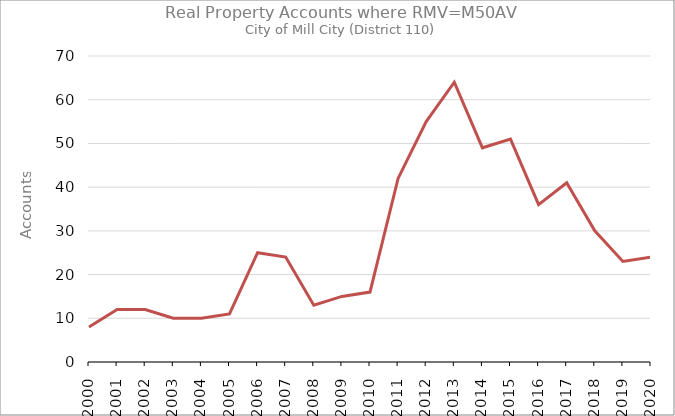
| Category | RMVM50AV |
|---|---|
| 2000.0 | 8 |
| 2001.0 | 12 |
| 2002.0 | 12 |
| 2003.0 | 10 |
| 2004.0 | 10 |
| 2005.0 | 11 |
| 2006.0 | 25 |
| 2007.0 | 24 |
| 2008.0 | 13 |
| 2009.0 | 15 |
| 2010.0 | 16 |
| 2011.0 | 42 |
| 2012.0 | 55 |
| 2013.0 | 64 |
| 2014.0 | 49 |
| 2015.0 | 51 |
| 2016.0 | 36 |
| 2017.0 | 41 |
| 2018.0 | 30 |
| 2019.0 | 23 |
| 2020.0 | 24 |